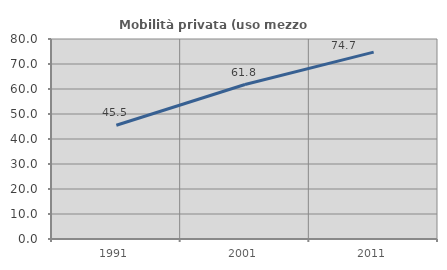
| Category | Mobilità privata (uso mezzo privato) |
|---|---|
| 1991.0 | 45.479 |
| 2001.0 | 61.789 |
| 2011.0 | 74.735 |